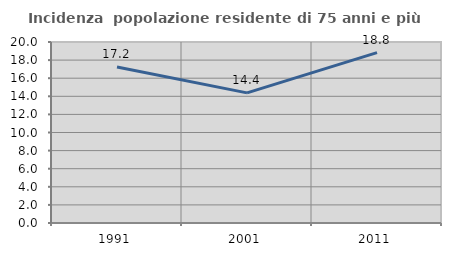
| Category | Incidenza  popolazione residente di 75 anni e più |
|---|---|
| 1991.0 | 17.233 |
| 2001.0 | 14.377 |
| 2011.0 | 18.824 |